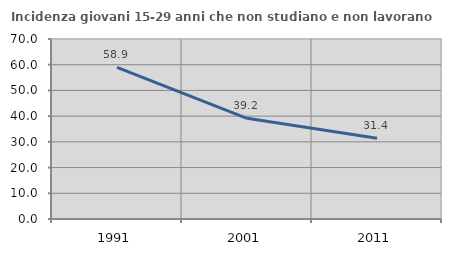
| Category | Incidenza giovani 15-29 anni che non studiano e non lavorano  |
|---|---|
| 1991.0 | 58.944 |
| 2001.0 | 39.157 |
| 2011.0 | 31.433 |